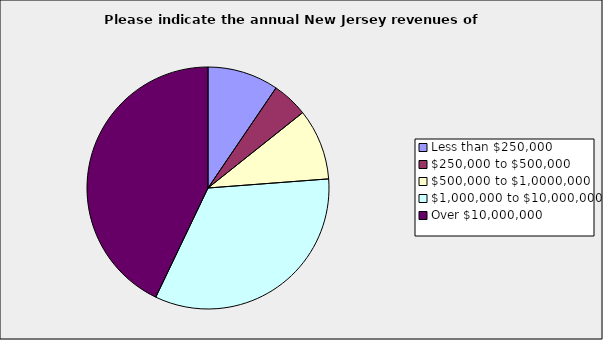
| Category | Series 0 |
|---|---|
| Less than $250,000 | 0.095 |
| $250,000 to $500,000 | 0.048 |
| $500,000 to $1,0000,000 | 0.095 |
| $1,000,000 to $10,000,000 | 0.333 |
| Over $10,000,000 | 0.429 |